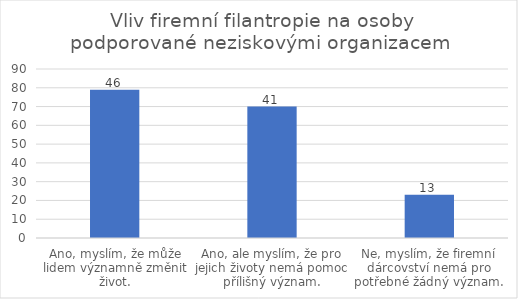
| Category | Počet respondentů |
|---|---|
| Ano, myslím, že může lidem významně změnit život. | 79 |
| Ano, ale myslím, že pro jejich životy nemá pomoc přílišný význam. | 70 |
| Ne, myslím, že firemní dárcovství nemá pro potřebné žádný význam. | 23 |